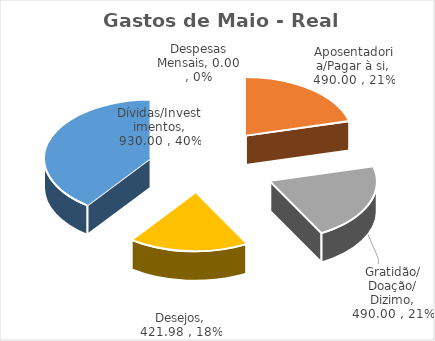
| Category | Gastos de Maio - Real Acumulado |
|---|---|
| Despesas Mensais | 0 |
| Aposentadoria/Pagar à si | 490 |
| Gratidão/ Doação/ Dizimo | 490 |
| Desejos | 421.98 |
| Dívidas/Investimentos | 930 |